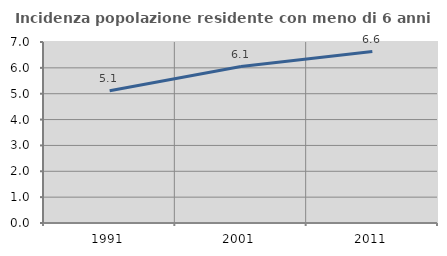
| Category | Incidenza popolazione residente con meno di 6 anni |
|---|---|
| 1991.0 | 5.113 |
| 2001.0 | 6.052 |
| 2011.0 | 6.63 |